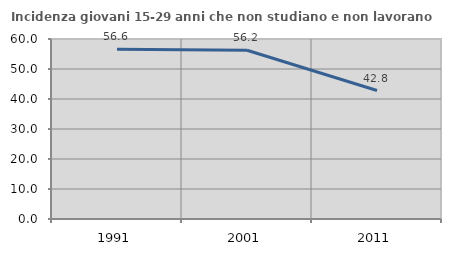
| Category | Incidenza giovani 15-29 anni che non studiano e non lavorano  |
|---|---|
| 1991.0 | 56.617 |
| 2001.0 | 56.235 |
| 2011.0 | 42.815 |